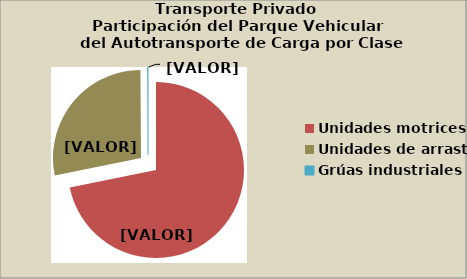
| Category | Series 0 |
|---|---|
| Unidades motrices | 71.832 |
| Unidades de arrastre | 28.122 |
| Grúas industriales | 0.1 |